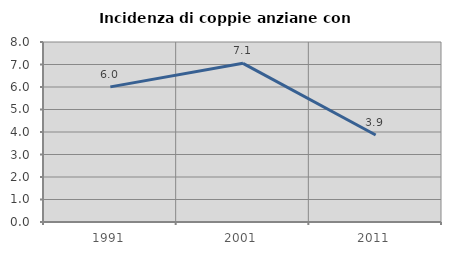
| Category | Incidenza di coppie anziane con figli |
|---|---|
| 1991.0 | 6.005 |
| 2001.0 | 7.051 |
| 2011.0 | 3.868 |